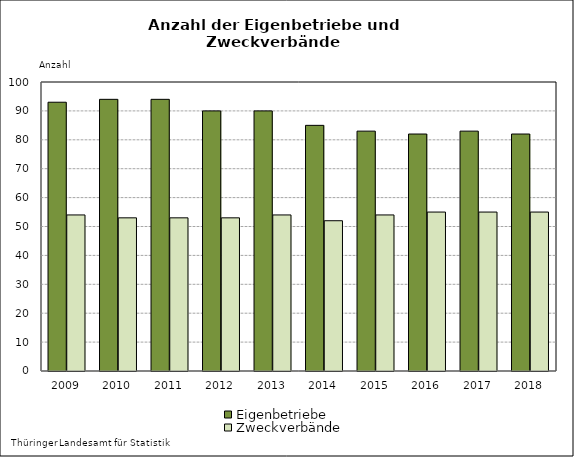
| Category | Eigenbetriebe | Zweckverbände |
|---|---|---|
| 2009.0 | 93 | 54 |
| 2010.0 | 94 | 53 |
| 2011.0 | 94 | 53 |
| 2012.0 | 90 | 53 |
| 2013.0 | 90 | 54 |
| 2014.0 | 85 | 52 |
| 2015.0 | 83 | 54 |
| 2016.0 | 82 | 55 |
| 2017.0 | 83 | 55 |
| 2018.0 | 82 | 55 |